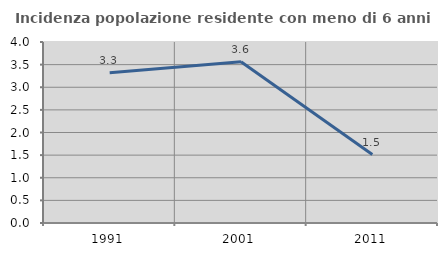
| Category | Incidenza popolazione residente con meno di 6 anni |
|---|---|
| 1991.0 | 3.321 |
| 2001.0 | 3.562 |
| 2011.0 | 1.514 |